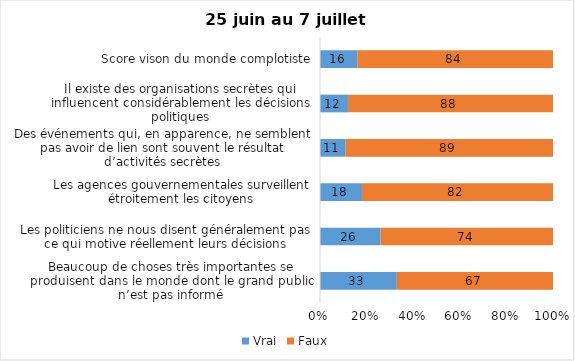
| Category | Vrai | Faux |
|---|---|---|
| Beaucoup de choses très importantes se produisent dans le monde dont le grand public n’est pas informé | 33 | 67 |
| Les politiciens ne nous disent généralement pas ce qui motive réellement leurs décisions | 26 | 74 |
| Les agences gouvernementales surveillent étroitement les citoyens | 18 | 82 |
| Des événements qui, en apparence, ne semblent pas avoir de lien sont souvent le résultat d’activités secrètes | 11 | 89 |
| Il existe des organisations secrètes qui influencent considérablement les décisions politiques | 12 | 88 |
| Score vison du monde complotiste | 16 | 84 |